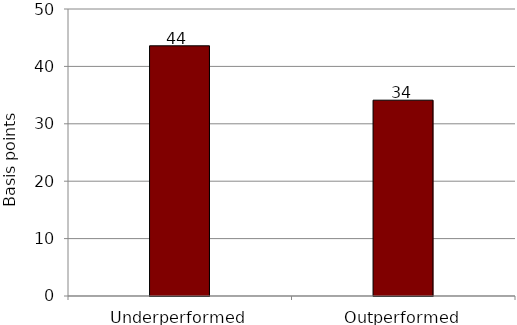
| Category | Series 0 |
|---|---|
| Underperformed | 43.587 |
| Outperformed | 34.116 |